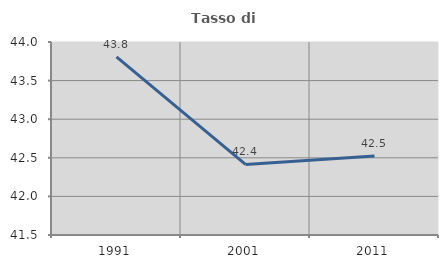
| Category | Tasso di occupazione   |
|---|---|
| 1991.0 | 43.807 |
| 2001.0 | 42.414 |
| 2011.0 | 42.523 |